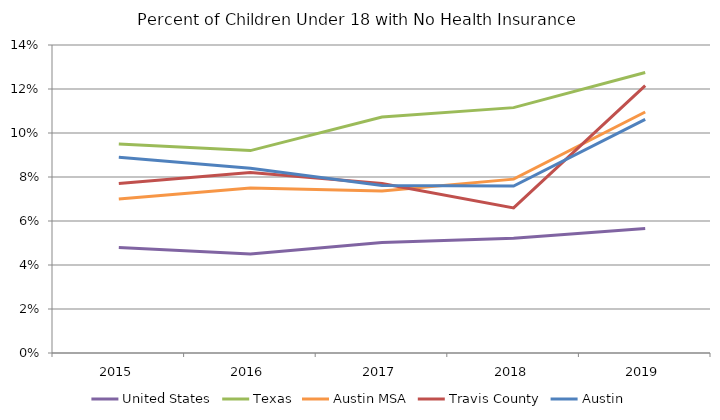
| Category | United States | Texas | Austin MSA | Travis County | Austin |
|---|---|---|---|---|---|
| 2015.0 | 0.048 | 0.095 | 0.07 | 0.077 | 0.089 |
| 2016.0 | 0.045 | 0.092 | 0.075 | 0.082 | 0.084 |
| 2017.0 | 0.05 | 0.107 | 0.074 | 0.077 | 0.076 |
| 2018.0 | 0.052 | 0.112 | 0.079 | 0.066 | 0.076 |
| 2019.0 | 0.057 | 0.127 | 0.11 | 0.122 | 0.106 |